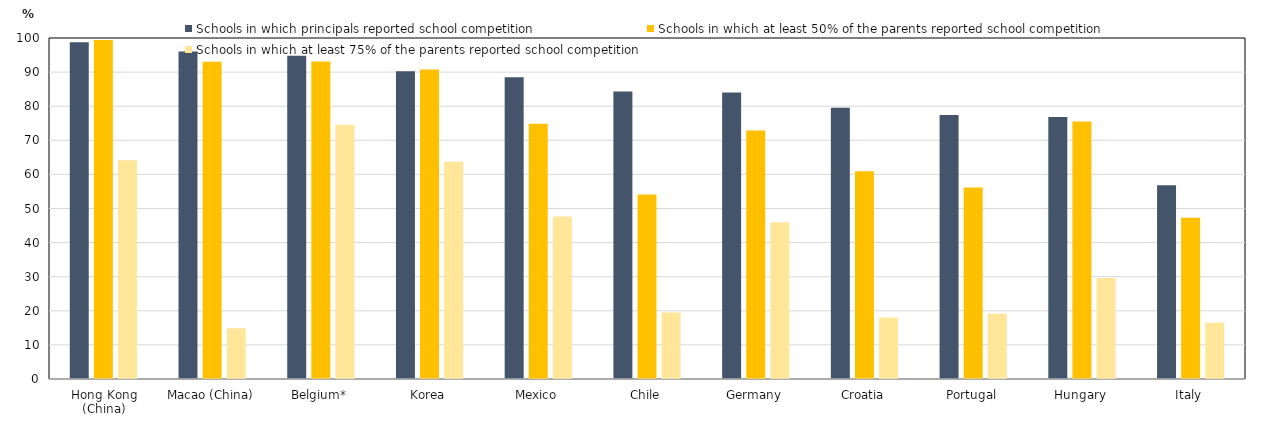
| Category | Schools in which principals reported school competition | Schools in which at least 50% of the parents reported school competition | Schools in which at least 75% of the parents reported school competition |
|---|---|---|---|
| Hong Kong (China) | 98.748 | 99.38 | 64.161 |
| Macao (China) | 96.068 | 93.005 | 14.88 |
| Belgium* | 94.814 | 93.134 | 74.571 |
| Korea | 90.283 | 90.798 | 63.724 |
| Mexico | 88.467 | 74.868 | 47.669 |
| Chile | 84.298 | 54.091 | 19.517 |
| Germany | 84.008 | 72.889 | 45.963 |
| Croatia | 79.558 | 60.947 | 18.033 |
| Portugal | 77.396 | 56.161 | 19.171 |
| Hungary | 76.864 | 75.481 | 29.596 |
| Italy | 56.843 | 47.269 | 16.52 |